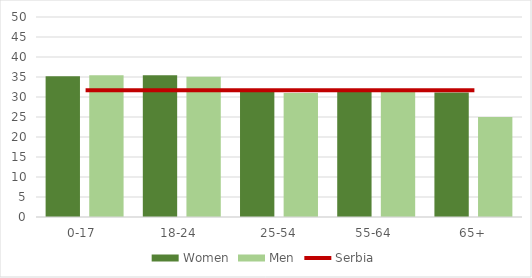
| Category | Women | Men |
|---|---|---|
| 0-17  | 35.211 | 35.448 |
| 18-24  | 35.466 | 35.032 |
| 25-54 | 31.522 | 30.971 |
| 55-64  | 31.227 | 31.803 |
| 65+ | 31.114 | 25.023 |